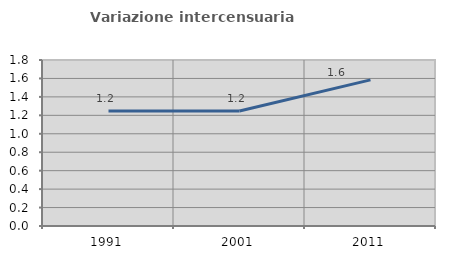
| Category | Variazione intercensuaria annua |
|---|---|
| 1991.0 | 1.248 |
| 2001.0 | 1.248 |
| 2011.0 | 1.584 |